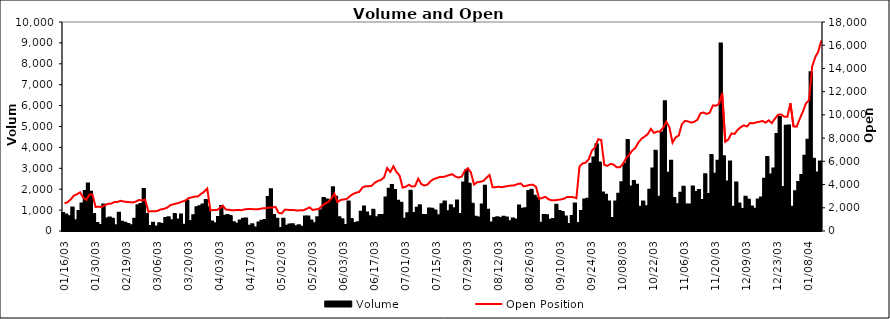
| Category | Volume |
|---|---|
| 2003-01-16 | 860 |
| 2003-01-17 | 786 |
| 2003-01-20 | 711 |
| 2003-01-21 | 1124 |
| 2003-01-22 | 519 |
| 2003-01-23 | 961 |
| 2003-01-24 | 1317 |
| 2003-01-27 | 1909 |
| 2003-01-28 | 2274 |
| 2003-01-29 | 1876 |
| 2003-01-30 | 814 |
| 2003-02-05 | 387 |
| 2003-02-06 | 289 |
| 2003-02-07 | 1270 |
| 2003-02-10 | 597 |
| 2003-02-11 | 648 |
| 2003-02-13 | 585 |
| 2003-02-14 | 279 |
| 2003-02-17 | 871 |
| 2003-02-18 | 443 |
| 2003-02-19 | 394 |
| 2003-02-20 | 337 |
| 2003-02-21 | 273 |
| 2003-02-24 | 582 |
| 2003-02-25 | 1228 |
| 2003-02-26 | 1290 |
| 2003-02-27 | 2004 |
| 2003-02-28 | 819 |
| 2003-03-03 | 236 |
| 2003-03-05 | 389 |
| 2003-03-06 | 221 |
| 2003-03-07 | 376 |
| 2003-03-10 | 339 |
| 2003-03-11 | 620 |
| 2003-03-12 | 662 |
| 2003-03-13 | 519 |
| 2003-03-14 | 819 |
| 2003-03-17 | 548 |
| 2003-03-18 | 791 |
| 2003-03-19 | 304 |
| 2003-03-20 | 1456 |
| 2003-03-21 | 474 |
| 2003-03-24 | 748 |
| 2003-03-25 | 1135 |
| 2003-03-26 | 1189 |
| 2003-03-27 | 1266 |
| 2003-03-28 | 1488 |
| 2003-03-31 | 1140 |
| 2003-04-01 | 457 |
| 2003-04-02 | 374 |
| 2003-04-03 | 675 |
| 2003-04-04 | 1195 |
| 2003-04-07 | 727 |
| 2003-04-08 | 770 |
| 2003-04-09 | 712 |
| 2003-04-10 | 424 |
| 2003-04-11 | 341 |
| 2003-04-14 | 498 |
| 2003-04-15 | 587 |
| 2003-04-16 | 595 |
| 2003-04-17 | 248 |
| 2003-04-18 | 328 |
| 2003-04-21 | 167 |
| 2003-04-22 | 401 |
| 2003-04-23 | 493 |
| 2003-04-24 | 523 |
| 2003-04-25 | 1621 |
| 2003-04-28 | 1996 |
| 2003-04-29 | 770 |
| 2003-04-30 | 591 |
| 2003-05-02 | 148 |
| 2003-05-05 | 592 |
| 2003-05-06 | 250 |
| 2003-05-07 | 307 |
| 2003-05-08 | 318 |
| 2003-05-09 | 225 |
| 2003-05-12 | 275 |
| 2003-05-13 | 208 |
| 2003-05-16 | 699 |
| 2003-05-19 | 692 |
| 2003-05-20 | 506 |
| 2003-05-21 | 369 |
| 2003-05-22 | 663 |
| 2003-05-23 | 991 |
| 2003-05-26 | 1583 |
| 2003-05-27 | 1504 |
| 2003-05-28 | 1466 |
| 2003-05-29 | 2091 |
| 2003-05-30 | 1634 |
| 2003-06-02 | 654 |
| 2003-06-03 | 568 |
| 2003-06-04 | 286 |
| 2003-06-05 | 1412 |
| 2003-06-06 | 576 |
| 2003-06-09 | 379 |
| 2003-06-10 | 416 |
| 2003-06-11 | 926 |
| 2003-06-12 | 1169 |
| 2003-06-13 | 880 |
| 2003-06-16 | 705 |
| 2003-06-17 | 1016 |
| 2003-06-18 | 656 |
| 2003-06-19 | 764 |
| 2003-06-20 | 766 |
| 2003-06-23 | 1603 |
| 2003-06-24 | 2020 |
| 2003-06-25 | 2196 |
| 2003-06-26 | 1965 |
| 2003-06-27 | 1445 |
| 2003-06-30 | 1348 |
| 2003-07-01 | 589 |
| 2003-07-02 | 849 |
| 2003-07-03 | 1931 |
| 2003-07-04 | 856 |
| 2003-07-07 | 1110 |
| 2003-07-08 | 1231 |
| 2003-07-09 | 760 |
| 2003-07-10 | 771 |
| 2003-07-11 | 1073 |
| 2003-07-14 | 1064 |
| 2003-07-15 | 985 |
| 2003-07-16 | 759 |
| 2003-07-17 | 1275 |
| 2003-07-18 | 1413 |
| 2003-07-21 | 950 |
| 2003-07-22 | 1227 |
| 2003-07-23 | 1093 |
| 2003-07-24 | 1461 |
| 2003-07-25 | 813 |
| 2003-07-28 | 2318 |
| 2003-07-29 | 2908 |
| 2003-07-30 | 2265 |
| 2003-07-31 | 1306 |
| 2003-08-01 | 686 |
| 2003-08-04 | 651 |
| 2003-08-05 | 1273 |
| 2003-08-06 | 2160 |
| 2003-08-07 | 1020 |
| 2003-08-08 | 406 |
| 2003-08-11 | 622 |
| 2003-08-12 | 659 |
| 2003-08-13 | 617 |
| 2003-08-14 | 685 |
| 2003-08-15 | 641 |
| 2003-08-18 | 466 |
| 2003-08-19 | 600 |
| 2003-08-20 | 553 |
| 2003-08-21 | 1222 |
| 2003-08-22 | 1060 |
| 2003-08-25 | 1092 |
| 2003-08-26 | 1916 |
| 2003-08-27 | 1975 |
| 2003-08-28 | 1687 |
| 2003-08-29 | 1569 |
| 2003-09-02 | 400 |
| 2003-09-03 | 761 |
| 2003-09-04 | 752 |
| 2003-09-05 | 535 |
| 2003-09-08 | 579 |
| 2003-09-09 | 1261 |
| 2003-09-10 | 953 |
| 2003-09-11 | 912 |
| 2003-09-12 | 696 |
| 2003-09-15 | 337 |
| 2003-09-16 | 717 |
| 2003-09-17 | 1318 |
| 2003-09-18 | 384 |
| 2003-09-19 | 959 |
| 2003-09-22 | 1503 |
| 2003-09-23 | 1544 |
| 2003-09-24 | 3215 |
| 2003-09-25 | 3514 |
| 2003-09-26 | 4146 |
| 2003-09-29 | 3272 |
| 2003-09-30 | 1847 |
| 2003-10-01 | 1734 |
| 2003-10-02 | 1412 |
| 2003-10-03 | 620 |
| 2003-10-06 | 1410 |
| 2003-10-07 | 1785 |
| 2003-10-08 | 2331 |
| 2003-10-09 | 3202 |
| 2003-10-10 | 4356 |
| 2003-10-13 | 2135 |
| 2003-10-14 | 2397 |
| 2003-10-15 | 2215 |
| 2003-10-16 | 1155 |
| 2003-10-17 | 1408 |
| 2003-10-20 | 1180 |
| 2003-10-21 | 1978 |
| 2003-10-22 | 2985 |
| 2003-10-23 | 3841 |
| 2003-10-27 | 1641 |
| 2003-10-28 | 4717 |
| 2003-10-29 | 6208 |
| 2003-10-30 | 2787 |
| 2003-10-31 | 3365 |
| 2003-11-03 | 1583 |
| 2003-11-04 | 1278 |
| 2003-11-05 | 1835 |
| 2003-11-06 | 2118 |
| 2003-11-07 | 1262 |
| 2003-11-10 | 1272 |
| 2003-11-11 | 2129 |
| 2003-11-12 | 1863 |
| 2003-11-13 | 1965 |
| 2003-11-14 | 1483 |
| 2003-11-17 | 2717 |
| 2003-11-18 | 1769 |
| 2003-11-19 | 3640 |
| 2003-11-20 | 2735 |
| 2003-11-21 | 3358 |
| 2003-11-27 | 8967 |
| 2003-11-28 | 3576 |
| 2003-12-01 | 2371 |
| 2003-12-02 | 3327 |
| 2003-12-03 | 1158 |
| 2003-12-04 | 2317 |
| 2003-12-05 | 1311 |
| 2003-12-08 | 1056 |
| 2003-12-09 | 1633 |
| 2003-12-10 | 1497 |
| 2003-12-11 | 1177 |
| 2003-12-12 | 1062 |
| 2003-12-15 | 1512 |
| 2003-12-16 | 1606 |
| 2003-12-17 | 2504 |
| 2003-12-18 | 3546 |
| 2003-12-19 | 2705 |
| 2003-12-22 | 2994 |
| 2003-12-23 | 4642 |
| 2003-12-24 | 5455 |
| 2003-12-26 | 2109 |
| 2003-12-29 | 5034 |
| 2003-12-30 | 5044 |
| 2003-12-31 | 1159 |
| 2004-01-02 | 1907 |
| 2004-01-05 | 2348 |
| 2004-01-06 | 2675 |
| 2004-01-07 | 3596 |
| 2004-01-08 | 4363 |
| 2004-01-09 | 7596 |
| 2004-01-12 | 3451 |
| 2004-01-13 | 2800 |
| 2004-01-14 | 3324 |